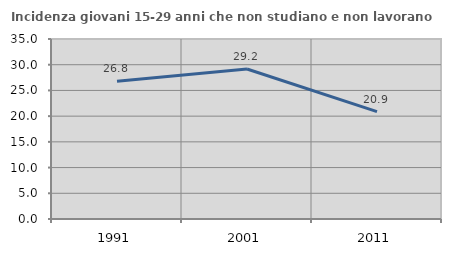
| Category | Incidenza giovani 15-29 anni che non studiano e non lavorano  |
|---|---|
| 1991.0 | 26.767 |
| 2001.0 | 29.167 |
| 2011.0 | 20.879 |